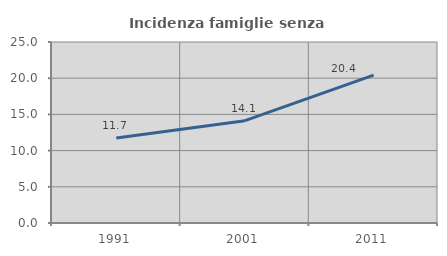
| Category | Incidenza famiglie senza nuclei |
|---|---|
| 1991.0 | 11.746 |
| 2001.0 | 14.13 |
| 2011.0 | 20.435 |